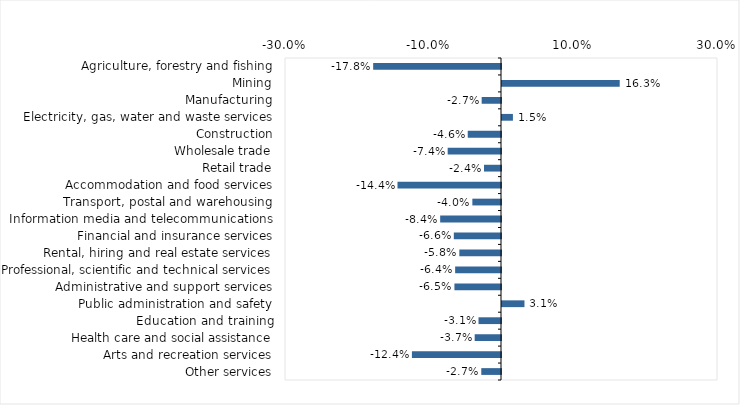
| Category | This week |
|---|---|
| Agriculture, forestry and fishing | -0.178 |
| Mining | 0.163 |
| Manufacturing | -0.027 |
| Electricity, gas, water and waste services | 0.015 |
| Construction | -0.046 |
| Wholesale trade | -0.074 |
| Retail trade | -0.024 |
| Accommodation and food services | -0.144 |
| Transport, postal and warehousing | -0.04 |
| Information media and telecommunications | -0.084 |
| Financial and insurance services | -0.066 |
| Rental, hiring and real estate services | -0.058 |
| Professional, scientific and technical services | -0.064 |
| Administrative and support services | -0.065 |
| Public administration and safety | 0.031 |
| Education and training | -0.031 |
| Health care and social assistance | -0.037 |
| Arts and recreation services | -0.124 |
| Other services | -0.027 |